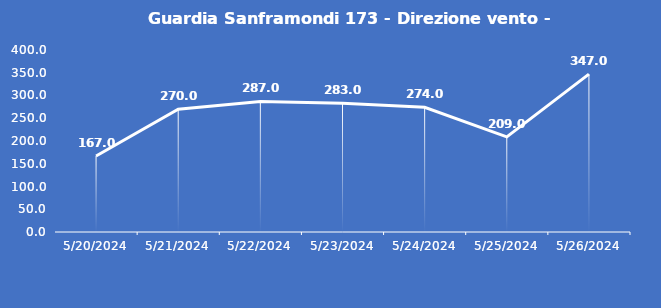
| Category | Guardia Sanframondi 173 - Direzione vento - Grezzo (°N) |
|---|---|
| 5/20/24 | 167 |
| 5/21/24 | 270 |
| 5/22/24 | 287 |
| 5/23/24 | 283 |
| 5/24/24 | 274 |
| 5/25/24 | 209 |
| 5/26/24 | 347 |